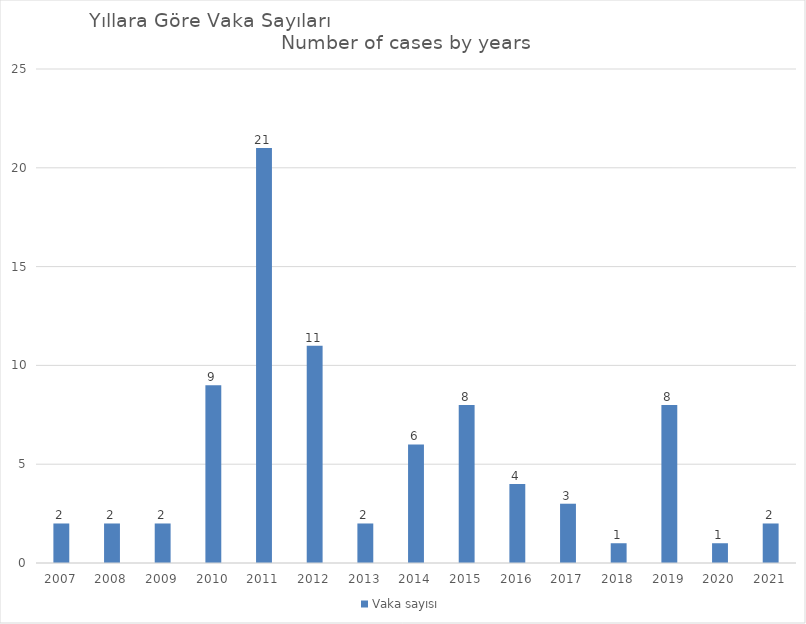
| Category | Vaka sayısı |
|---|---|
| 2007.0 | 2 |
| 2008.0 | 2 |
| 2009.0 | 2 |
| 2010.0 | 9 |
| 2011.0 | 21 |
| 2012.0 | 11 |
| 2013.0 | 2 |
| 2014.0 | 6 |
| 2015.0 | 8 |
| 2016.0 | 4 |
| 2017.0 | 3 |
| 2018.0 | 1 |
| 2019.0 | 8 |
| 2020.0 | 1 |
| 2021.0 | 2 |